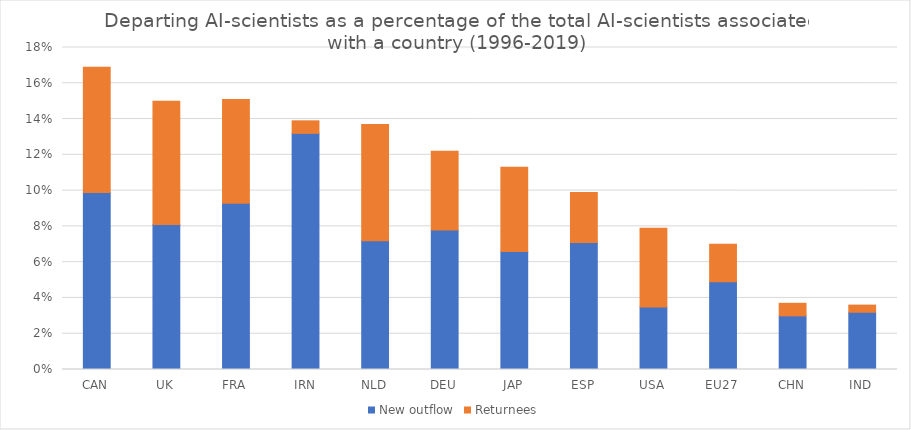
| Category | New outflow | Returnees |
|---|---|---|
| CAN | 0.099 | 0.07 |
| UK | 0.081 | 0.069 |
| FRA | 0.093 | 0.058 |
| IRN | 0.132 | 0.007 |
| NLD | 0.072 | 0.065 |
| DEU | 0.078 | 0.044 |
| JAP | 0.066 | 0.047 |
| ESP | 0.071 | 0.028 |
| USA | 0.035 | 0.044 |
| EU27 | 0.049 | 0.021 |
| CHN | 0.03 | 0.007 |
| IND | 0.032 | 0.004 |